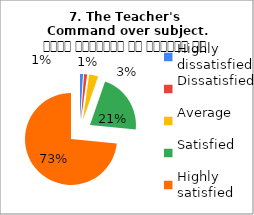
| Category | 7. The Teacher's 
Command over subject. विषय अवधारणा पर शिक्षक का ज्ञान |
|---|---|
| Highly dissatisfied | 1 |
| Dissatisfied | 1 |
| Average | 3 |
| Satisfied | 20 |
| Highly satisfied | 69 |